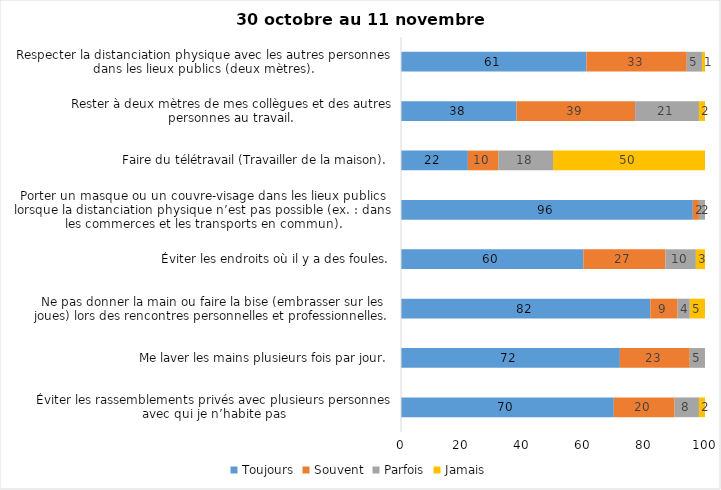
| Category | Toujours | Souvent | Parfois | Jamais |
|---|---|---|---|---|
| Éviter les rassemblements privés avec plusieurs personnes avec qui je n’habite pas | 70 | 20 | 8 | 2 |
| Me laver les mains plusieurs fois par jour. | 72 | 23 | 5 | 0 |
| Ne pas donner la main ou faire la bise (embrasser sur les joues) lors des rencontres personnelles et professionnelles. | 82 | 9 | 4 | 5 |
| Éviter les endroits où il y a des foules. | 60 | 27 | 10 | 3 |
| Porter un masque ou un couvre-visage dans les lieux publics lorsque la distanciation physique n’est pas possible (ex. : dans les commerces et les transports en commun). | 96 | 2 | 2 | 0 |
| Faire du télétravail (Travailler de la maison). | 22 | 10 | 18 | 50 |
| Rester à deux mètres de mes collègues et des autres personnes au travail. | 38 | 39 | 21 | 2 |
| Respecter la distanciation physique avec les autres personnes dans les lieux publics (deux mètres). | 61 | 33 | 5 | 1 |